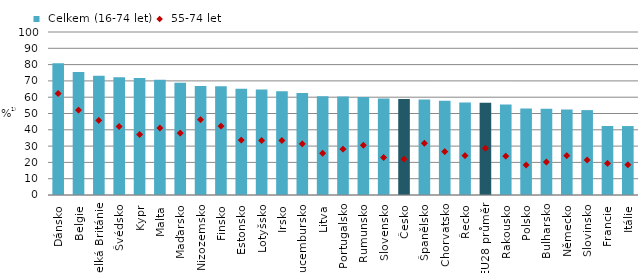
| Category |  Celkem (16-74 let) |
|---|---|
| Dánsko | 80.763 |
| Belgie | 75.526 |
| Velká Británie | 73.126 |
| Švédsko | 72.221 |
| Kypr | 71.716 |
| Malta | 70.661 |
| Maďarsko | 68.857 |
| Nizozemsko | 66.905 |
| Finsko | 66.681 |
| Estonsko | 65.138 |
| Lotyšsko | 64.662 |
| Irsko | 63.577 |
| Lucembursko | 62.511 |
| Litva | 60.571 |
| Portugalsko | 60.401 |
| Rumunsko | 60.176 |
| Slovensko | 59.245 |
| Česko | 58.95 |
| Španělsko | 58.608 |
| Chorvatsko | 57.879 |
| Řecko | 56.693 |
| EU28 průměr | 56.567 |
| Rakousko | 55.555 |
| Polsko | 53.039 |
| Bulharsko | 52.853 |
| Německo | 52.503 |
| Slovinsko | 52.085 |
| Francie | 42.324 |
| Itálie | 42.295 |